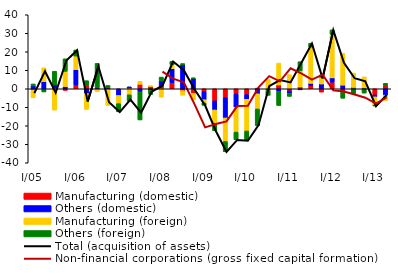
| Category | Manufacturing (domestic) | Others (domestic) | Manufacturing (foreign) | Others (foreign) |
|---|---|---|---|---|
| I/05 | -0.637 | 1.589 | -4.266 | 1.036 |
| II | -0.486 | 3.85 | 7.501 | -1.215 |
| III | 0.249 | 1.884 | -11.51 | 7.366 |
| IV | -0.868 | 1.169 | 8.267 | 6.768 |
| I/06 | 2.003 | 8.337 | 7.348 | 3.264 |
| II | 1.824 | -2.581 | -8.547 | 2.56 |
| III | 0.631 | -0.215 | -1.26 | 13.086 |
| IV | 0.605 | -0.251 | -8.74 | 1.191 |
| I/07 | -0.453 | -3.156 | -4.422 | -4.435 |
| II | 0.322 | 0.746 | -3.237 | -3.521 |
| III | 2.465 | -1.627 | 1.576 | -15.211 |
| IV | 1.291 | -0.602 | 0.369 | -2.43 |
| I/08 | 1.514 | 2.734 | -4.535 | 2.087 |
| II | 3.2 | 7.614 | 2.24 | 1.761 |
| III | -1.007 | 12.934 | -2.467 | 0.701 |
| IV | -2.405 | 5.574 | -3.587 | 0.326 |
| I/09 | -1.346 | -4.571 | -1.756 | -1.274 |
| II | -6.52 | -4.939 | -7.295 | -3.947 |
| III | -4.747 | -11.037 | -12.714 | -5.571 |
| IV | -2.748 | -7.322 | -13.326 | -4.151 |
| I/10 | -3.133 | -2.558 | -17.105 | -5.152 |
| II | 0.386 | -2.702 | -8.195 | -9.036 |
| III | -0.81 | 0.151 | 4.909 | -2.731 |
| IV | 2.077 | -1.457 | 11.807 | -7.593 |
| I/11 | -1.114 | -1.274 | 7.66 | -1.725 |
| II | 1.01 | -0.581 | 8.67 | 4.965 |
| III | 1.712 | 1.215 | 19.652 | 2.047 |
| IV | -1.774 | 2.598 | 3.64 | 1.292 |
| I/12 | 3.578 | 2.314 | 23.577 | 2.383 |
| II | -1.706 | 1.962 | 17.236 | -3.393 |
| III | 0.464 | 0.261 | 7.788 | -2.698 |
| IV | 0.351 | 0.093 | 6.021 | -2.312 |
| I/13 | -3.327 | -1.032 | -4.534 | -0.396 |
| II | 1.654 | -3.453 | -2.764 | 1.291 |